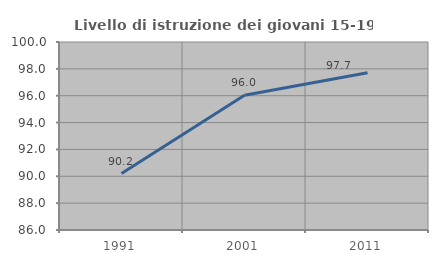
| Category | Livello di istruzione dei giovani 15-19 anni |
|---|---|
| 1991.0 | 90.202 |
| 2001.0 | 96.032 |
| 2011.0 | 97.715 |